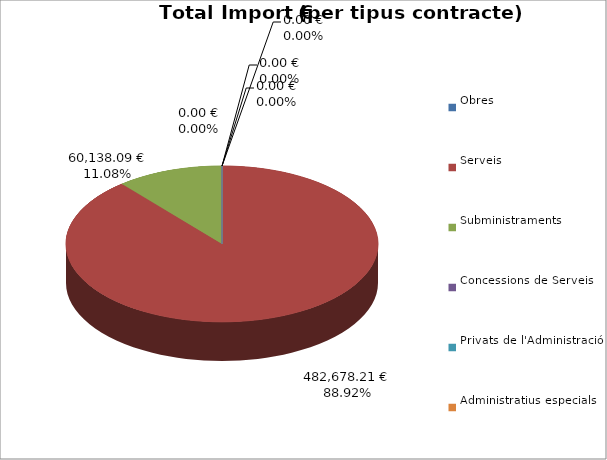
| Category | Total preu
(amb IVA) |
|---|---|
| Obres | 0 |
| Serveis | 482678.21 |
| Subministraments | 60138.09 |
| Concessions de Serveis | 0 |
| Privats de l'Administració | 0 |
| Administratius especials | 0 |